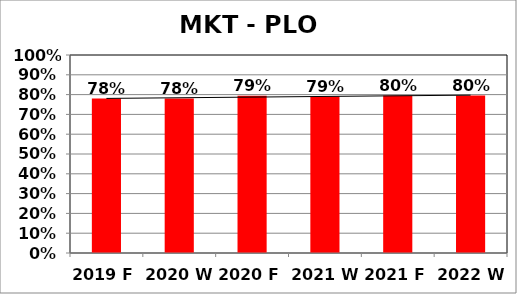
| Category | Series 0 |
|---|---|
| 2019 F | 0.78 |
| 2020 W | 0.78 |
| 2020 F | 0.794 |
| 2021 W | 0.79 |
| 2021 F | 0.795 |
| 2022 W | 0.795 |